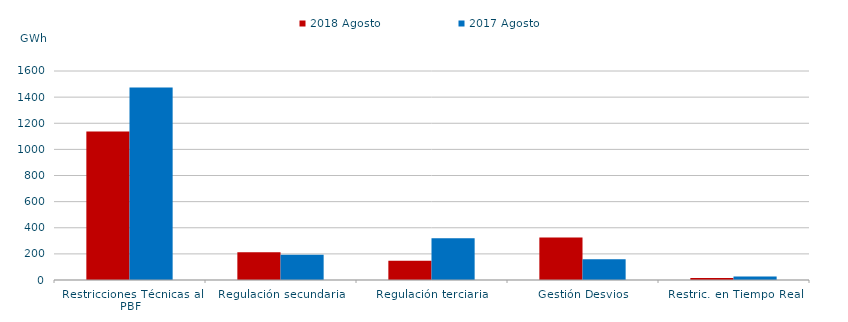
| Category | 2018 Agosto | 2017 Agosto |
|---|---|---|
| Restricciones Técnicas al PBF | 1137.454 | 1473.239 |
| Regulación secundaria | 212.913 | 192.481 |
| Regulación terciaria | 147.488 | 319.97 |
| Gestión Desvios | 325.988 | 159.209 |
| Restric. en Tiempo Real | 15.484 | 26.627 |